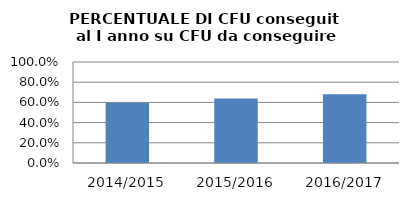
| Category | 2014/2015 2015/2016 2016/2017 |
|---|---|
| 2014/2015 | 0.597 |
| 2015/2016 | 0.638 |
| 2016/2017 | 0.68 |